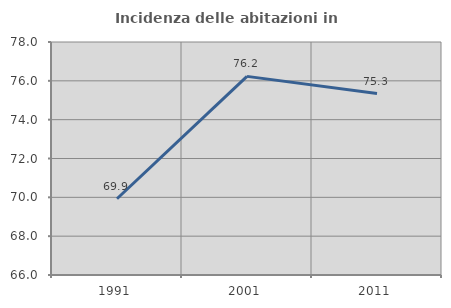
| Category | Incidenza delle abitazioni in proprietà  |
|---|---|
| 1991.0 | 69.929 |
| 2001.0 | 76.229 |
| 2011.0 | 75.344 |